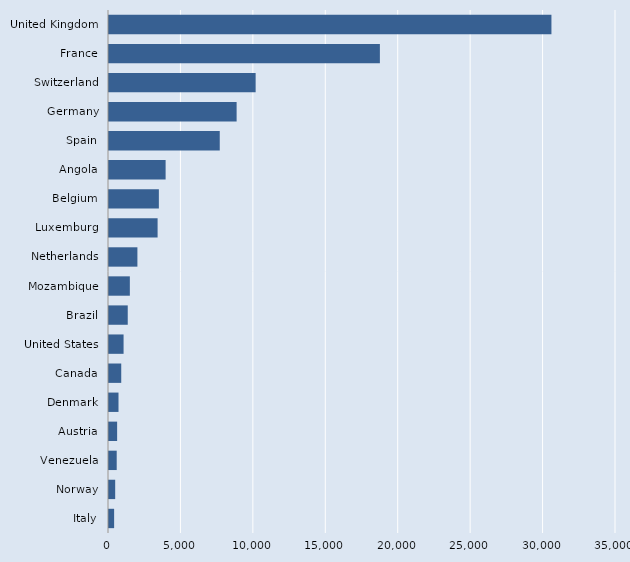
| Category | Series 0 |
|---|---|
| Italy | 354 |
| Norway | 427 |
| Venezuela | 532 |
| Austria | 561 |
| Denmark | 656 |
| Canada | 845 |
| United States | 1006 |
| Brazil | 1294 |
| Mozambique | 1439 |
| Netherlands | 1961 |
| Luxemburg | 3355 |
| Belgium | 3442 |
| Angola | 3908 |
| Spain | 7646 |
| Germany | 8810 |
| Switzerland | 10123 |
| France | 18700 |
| United Kingdom | 30543 |